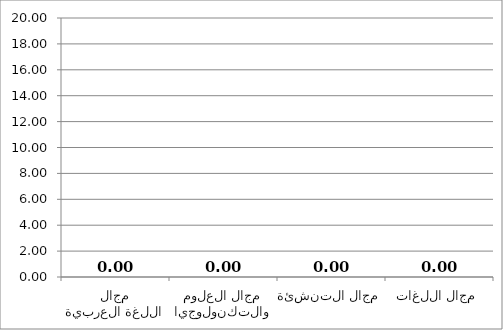
| Category | Series 0 |
|---|---|
| مجال اللغة العربية | 0 |
| مجال العلوم والتكنولوجيا | 0 |
| مجال التنشئة | 0 |
| مجال اللغات | 0 |